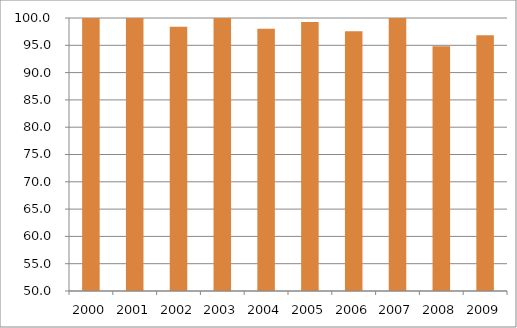
| Category | Região Sul |
|---|---|
| 2000.0 | 101.27 |
| 2001.0 | 102.8 |
| 2002.0 | 98.42 |
| 2003.0 | 100.24 |
| 2004.0 | 98.02 |
| 2005.0 | 99.27 |
| 2006.0 | 97.57 |
| 2007.0 | 101.5 |
| 2008.0 | 94.82 |
| 2009.0 | 96.84 |